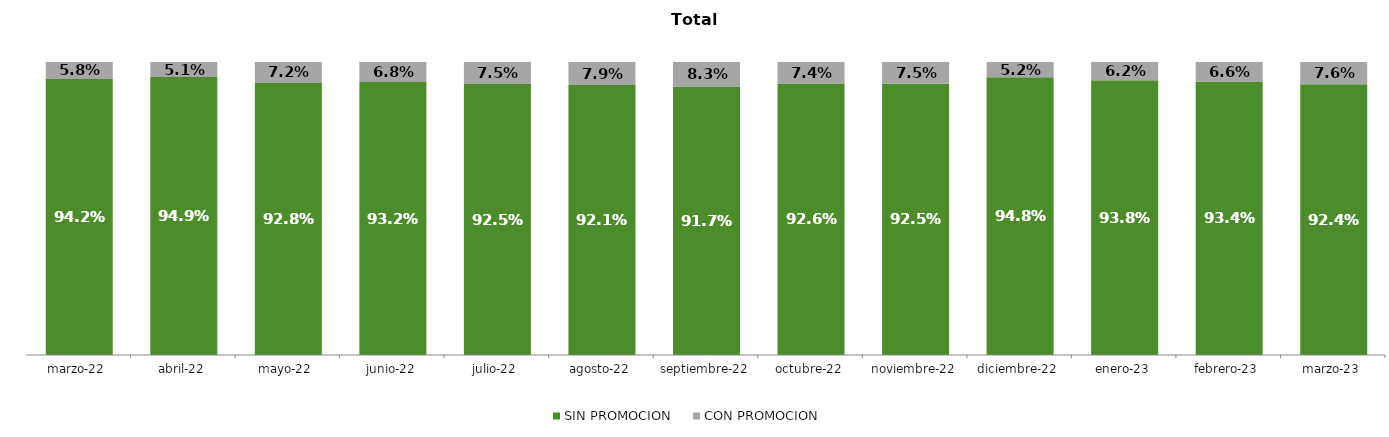
| Category | SIN PROMOCION   | CON PROMOCION   |
|---|---|---|
| 2022-03-01 | 0.942 | 0.058 |
| 2022-04-01 | 0.949 | 0.051 |
| 2022-05-01 | 0.928 | 0.072 |
| 2022-06-01 | 0.932 | 0.068 |
| 2022-07-01 | 0.925 | 0.075 |
| 2022-08-01 | 0.921 | 0.079 |
| 2022-09-01 | 0.917 | 0.083 |
| 2022-10-01 | 0.926 | 0.074 |
| 2022-11-01 | 0.925 | 0.075 |
| 2022-12-01 | 0.948 | 0.052 |
| 2023-01-01 | 0.938 | 0.062 |
| 2023-02-01 | 0.934 | 0.066 |
| 2023-03-01 | 0.924 | 0.076 |